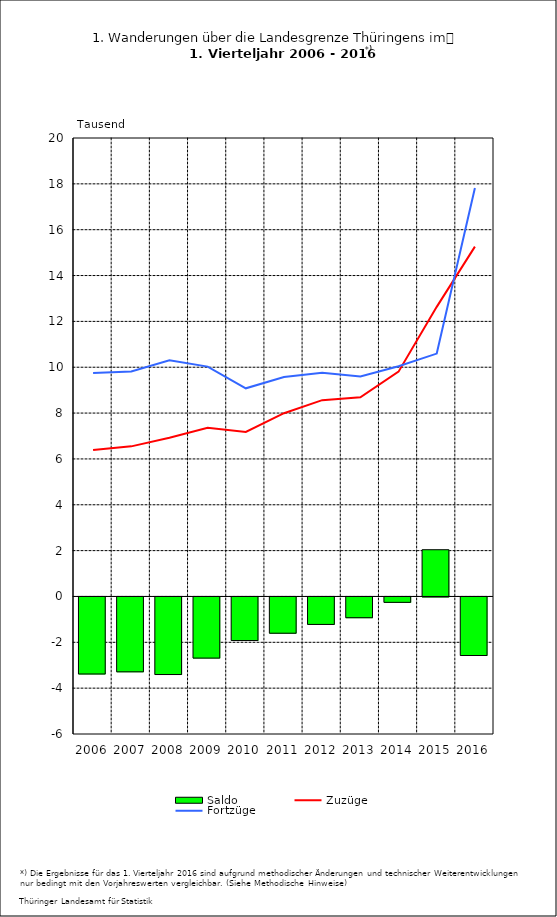
| Category | Saldo |
|---|---|
| 2006.0 | -3.361 |
| 2007.0 | -3.266 |
| 2008.0 | -3.384 |
| 2009.0 | -2.667 |
| 2010.0 | -1.902 |
| 2011.0 | -1.582 |
| 2012.0 | -1.198 |
| 2013.0 | -0.906 |
| 2014.0 | -0.235 |
| 2015.0 | 2.039 |
| 2016.0 | -2.554 |